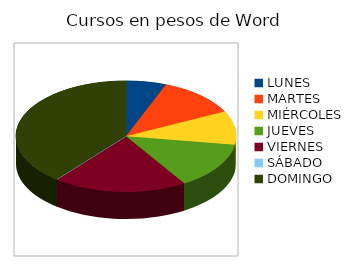
| Category | WORD |
|---|---|
| LUNES | 600 |
| MARTES | 1200 |
| MIÉRCOLES | 1000 |
| JUEVES | 1400 |
| VIERNES | 2000 |
| SÁBADO | 0 |
| DOMINGO | 4000 |